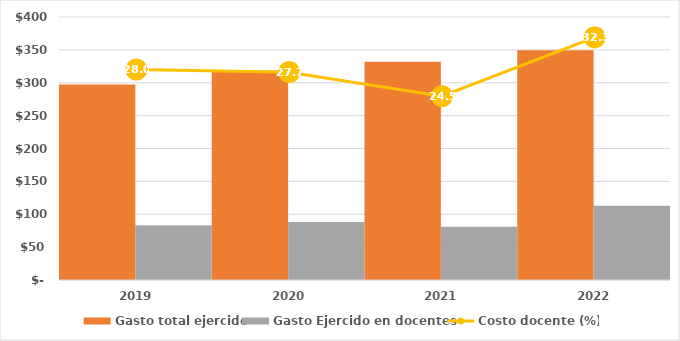
| Category | Gasto total ejercido | Gasto Ejercido en docentes |
|---|---|---|
| 2019 | 297383.7 | 83288.235 |
| 2020 | 318785.247 | 88166.964 |
| 2021 | 331789.211 | 81169.717 |
| 2022 | 349320.095 | 112780.061 |